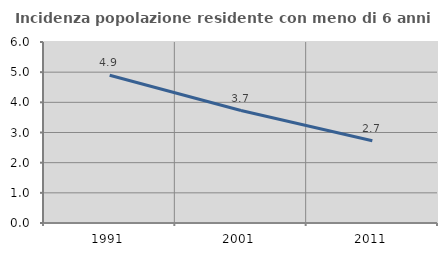
| Category | Incidenza popolazione residente con meno di 6 anni |
|---|---|
| 1991.0 | 4.896 |
| 2001.0 | 3.727 |
| 2011.0 | 2.725 |